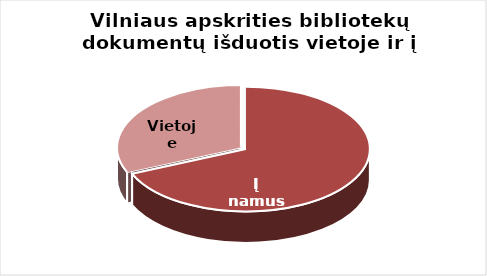
| Category | Series 0 |
|---|---|
| Į namus | 1740439 |
| Vietoje | 799523 |